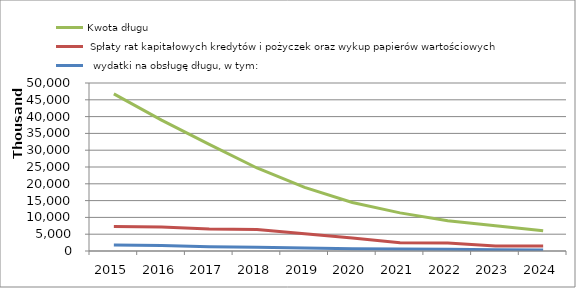
| Category | Kwota długu |  Spłaty rat kapitałowych kredytów i pożyczek oraz wykup papierów wartościowych |   wydatki na obsługę długu, w tym: |
|---|---|---|---|
| 2015.0 | 46748988 | 7257181 | 1800000 |
| 2016.0 | 38964903 | 7129323 | 1600000 |
| 2017.0 | 31752865 | 6557276 | 1300000 |
| 2018.0 | 24707174 | 6390929 | 1100000 |
| 2019.0 | 18944136 | 5108276 | 900000 |
| 2020.0 | 14454762 | 3834612 | 700000 |
| 2021.0 | 11350000 | 2450000 | 600000 |
| 2022.0 | 9000000 | 2350000 | 500000 |
| 2023.0 | 7500000 | 1500000 | 400000 |
| 2024.0 | 6000000 | 1500000 | 300000 |